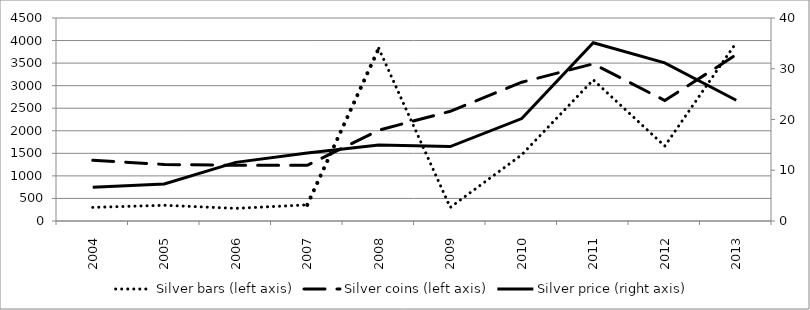
| Category | Silver bars (left axis) | Silver coins (left axis) |
|---|---|---|
| 2004.0 | 301.704 | 1346.782 |
| 2005.0 | 348.359 | 1253.471 |
| 2006.0 | 279.932 | 1234.809 |
| 2007.0 | 357.69 | 1234.809 |
| 2008.0 | 3825.73 | 2012.396 |
| 2009.0 | 301.704 | 2432.294 |
| 2010.0 | 1468.085 | 3076.136 |
| 2011.0 | 3129.012 | 3483.592 |
| 2012.0 | 1660.927 | 2671.791 |
| 2013.0 | 3953.255 | 3685.765 |